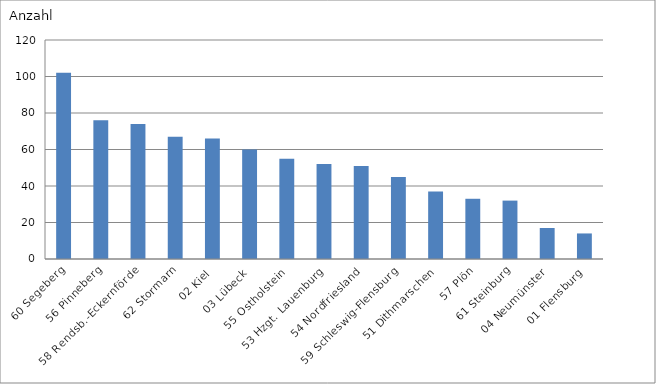
| Category | 60 Segeberg |
|---|---|
| 60 Segeberg | 102 |
| 56 Pinneberg | 76 |
| 58 Rendsb.-Eckernförde | 74 |
| 62 Stormarn | 67 |
| 02 Kiel | 66 |
| 03 Lübeck | 60 |
| 55 Ostholstein | 55 |
| 53 Hzgt. Lauenburg | 52 |
| 54 Nordfriesland | 51 |
| 59 Schleswig-Flensburg | 45 |
| 51 Dithmarschen | 37 |
| 57 Plön | 33 |
| 61 Steinburg | 32 |
| 04 Neumünster | 17 |
| 01 Flensburg | 14 |